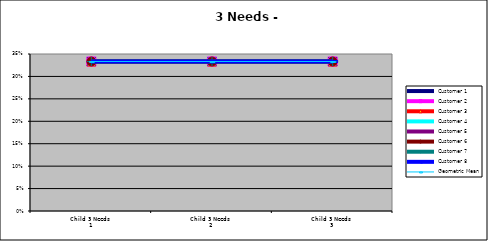
| Category | Customer 1 | Customer 2 | Customer 3 | Customer 4 | Customer 5 | Customer 6 | Customer 7 | Customer 8 | Geometric Mean |
|---|---|---|---|---|---|---|---|---|---|
| Child 3 Needs 1 | 0.333 | 0.333 | 0.333 | 0.333 | 0.333 | 0.333 | 0.333 | 0.333 | 0.333 |
| Child 3 Needs 2 | 0.333 | 0.333 | 0.333 | 0.333 | 0.333 | 0.333 | 0.333 | 0.333 | 0.333 |
| Child 3 Needs 3 | 0.333 | 0.333 | 0.333 | 0.333 | 0.333 | 0.333 | 0.333 | 0.333 | 0.333 |